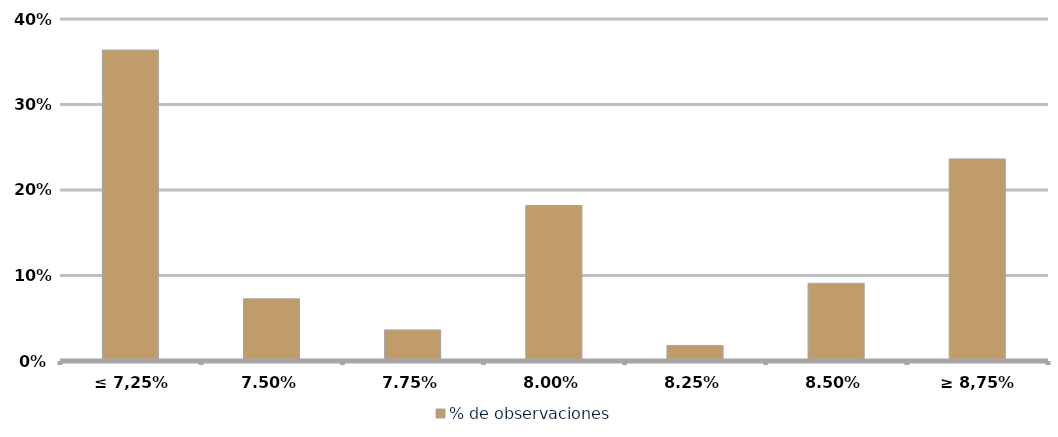
| Category | % de observaciones  |
|---|---|
| ≤ 7,25% | 0.364 |
| 7,50% | 0.073 |
| 7,75% | 0.036 |
| 8,00% | 0.182 |
| 8,25% | 0.018 |
| 8,50% | 0.091 |
| ≥ 8,75% | 0.236 |